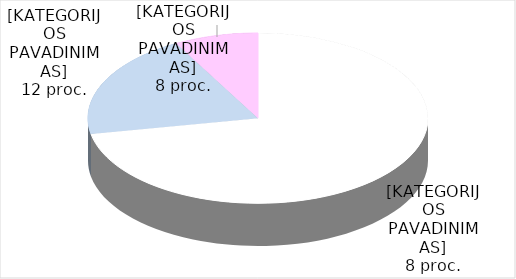
| Category | Series 0 |
|---|---|
| 0 | 18 |
| 1 | 5 |
| 2 | 2 |